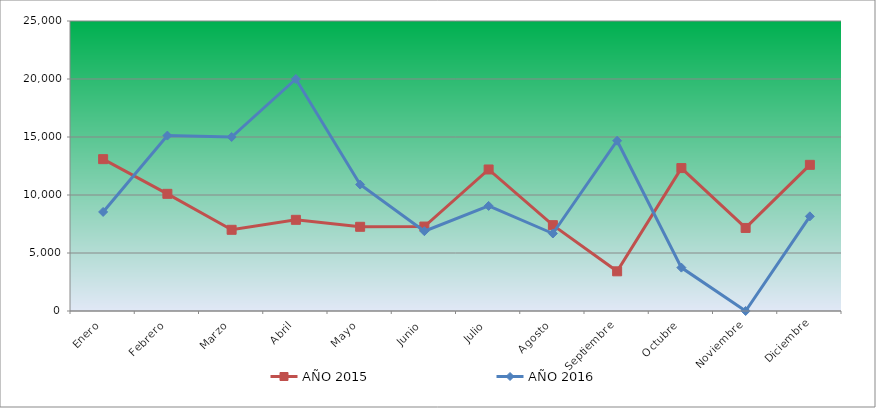
| Category | AÑO 2015 | AÑO 2016 |
|---|---|---|
| Enero | 13090 | 8540 |
| Febrero | 10100 | 15120 |
| Marzo | 7000 | 15000 |
| Abril | 7860 | 20000 |
| Mayo | 7260 | 10900 |
| Junio | 7280 | 6880 |
| Julio | 12200 | 9060 |
| Agosto | 7400 | 6680 |
| Septiembre | 3420 | 14680 |
| Octubre | 12320 | 3740 |
| Noviembre | 7160 | 0 |
| Diciembre | 12600 | 8160 |